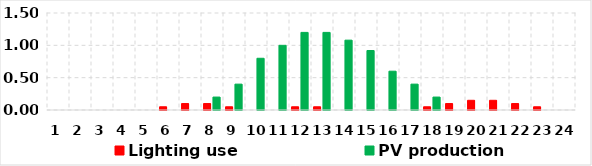
| Category | Lighting use | PV production |
|---|---|---|
| 0 | 0 | 0 |
| 1 | 0 | 0 |
| 2 | 0 | 0 |
| 3 | 0 | 0 |
| 4 | 0 | 0 |
| 5 | 0.05 | 0 |
| 6 | 0.1 | 0 |
| 7 | 0.1 | 0.2 |
| 8 | 0.05 | 0.4 |
| 9 | 0 | 0.8 |
| 10 | 0 | 1 |
| 11 | 0.05 | 1.2 |
| 12 | 0.05 | 1.2 |
| 13 | 0 | 1.08 |
| 14 | 0 | 0.92 |
| 15 | 0 | 0.6 |
| 16 | 0 | 0.4 |
| 17 | 0.05 | 0.2 |
| 18 | 0.1 | 0 |
| 19 | 0.15 | 0 |
| 20 | 0.15 | 0 |
| 21 | 0.1 | 0 |
| 22 | 0.05 | 0 |
| 23 | 0 | 0 |